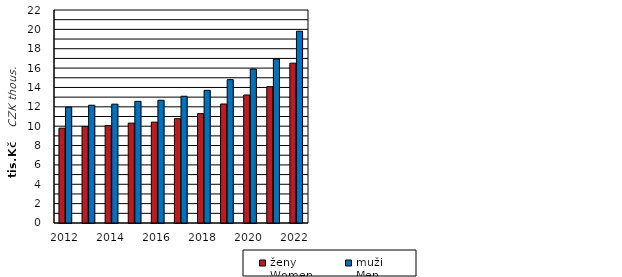
| Category | ženy  
Women | muži  
Men |
|---|---|---|
| 2012.0 | 9797 | 11962 |
| 2013.0 | 9970 | 12165 |
| 2014.0 | 10065 | 12274 |
| 2015.0 | 10316 | 12566 |
| 2016.0 | 10416 | 12678 |
| 2017.0 | 10772 | 13093 |
| 2018.0 | 11296 | 13703 |
| 2019.0 | 12292 | 14807 |
| 2020.0 | 13221 | 15898 |
| 2021.0 | 14080 | 16938 |
| 2022.0 | 16509 | 19807 |